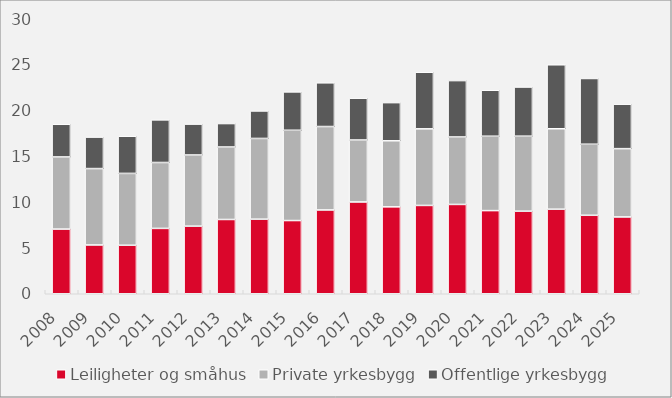
| Category | Leiligheter og småhus | Private yrkesbygg | Offentlige yrkesbygg |
|---|---|---|---|
| 2008.0 | 7.055 | 7.871 | 3.563 |
| 2009.0 | 5.323 | 8.333 | 3.434 |
| 2010.0 | 5.291 | 7.838 | 4.055 |
| 2011.0 | 7.13 | 7.189 | 4.649 |
| 2012.0 | 7.375 | 7.764 | 3.368 |
| 2013.0 | 8.102 | 7.907 | 2.558 |
| 2014.0 | 8.136 | 8.806 | 2.998 |
| 2015.0 | 7.986 | 9.849 | 4.184 |
| 2016.0 | 9.142 | 9.101 | 4.769 |
| 2017.0 | 10.013 | 6.762 | 4.558 |
| 2018.0 | 9.48 | 7.207 | 4.163 |
| 2019.0 | 9.634 | 8.358 | 6.171 |
| 2020.0 | 9.744 | 7.361 | 6.149 |
| 2021.0 | 9.07 | 8.115 | 5.016 |
| 2022.0 | 9.008 | 8.184 | 5.36 |
| 2023.0 | 9.224 | 8.775 | 6.98 |
| 2024.0 | 8.561 | 7.752 | 7.172 |
| 2025.0 | 8.381 | 7.447 | 4.85 |